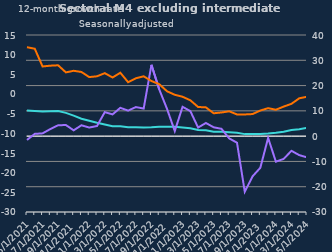
| Category | zero | Households | Non-intermediate OFCs |
|---|---|---|---|
| May-2021 | 0 | 10.1 | -1.5 |
| Jun-2021 | 0 | 9.9 | 0.9 |
| Jul-2021 | 0 | 9.7 | 1.1 |
| Aug-2021 | 0 | 9.8 | 2.8 |
| Sep-2021 | 0 | 9.9 | 4.3 |
| Oct-2021 | 0 | 9.2 | 4.4 |
| Nov-2021 | 0 | 8.1 | 2.3 |
| Dec-2021 | 0 | 6.9 | 4.3 |
| Jan-2022 | 0 | 6.1 | 3.4 |
| Feb-2022 | 0 | 5.3 | 4 |
| Mar-2022 | 0 | 4.6 | 9.5 |
| Apr-2022 | 0 | 3.9 | 8.6 |
| May-2022 | 0 | 3.9 | 11.2 |
| Jun-2022 | 0 | 3.5 | 10.1 |
| Jul-2022 | 0 | 3.5 | 11.5 |
| Aug-2022 | 0 | 3.4 | 10.9 |
| Sep-2022 | 0 | 3.5 | 28.2 |
| Oct-2022 | 0 | 3.7 | 18.5 |
| Nov-2022 | 0 | 3.7 | 10.8 |
| Dec-2022 | 0 | 3.7 | 2 |
| Jan-2023 | 0 | 3.4 | 11.6 |
| Feb-2023 | 0 | 3.1 | 9.9 |
| Mar-2023 | 0 | 2.4 | 3.4 |
| Apr-2023 | 0 | 2.3 | 5.2 |
| May-2023 | 0 | 1.7 | 3.5 |
| Jun-2023 | 0 | 1.7 | 2.9 |
| Jul-2023 | 0 | 1.5 | -0.9 |
| Aug-2023 | 0 | 1.3 | -2.6 |
| Sep-2023 | 0 | 0.8 | -22 |
| Oct-2023 | 0 | 0.8 | -15.9 |
| Nov-2023 | 0 | 0.8 | -12.5 |
| Dec-2023 | 0 | 1 | -0.7 |
| Jan-2024 | 0 | 1.3 | -10.1 |
| Feb-2024 | 0 | 1.7 | -9 |
| Mar-2024 | 0 | 2.4 | -5.8 |
| Apr-2024 | 0 | 2.7 | -7.5 |
| May-2024 | 0 | 3.3 | -8.4 |